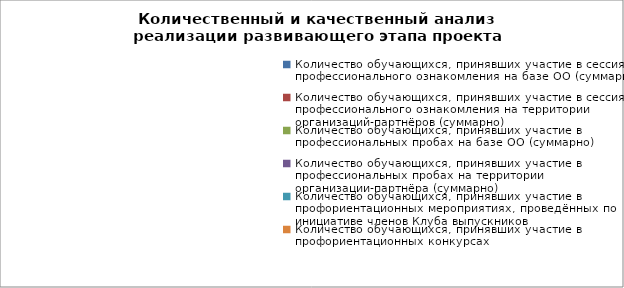
| Category | Series 0 |
|---|---|
| Количество обучающихся, принявших участие в сессиях профессионального ознакомления на базе ОО (суммарно) | 0 |
| Количество обучающихся, принявших участие в сессиях профессионального ознакомления на территории организаций-партнёров (суммарно) | 0 |
| Количество обучающихся, принявших участие в профессиональных пробах на базе ОО (суммарно) | 0 |
| Количество обучающихся, принявших участие в профессиональных пробах на территории организации-партнёра (суммарно) | 0 |
| Количество обучающихся, принявших участие в профориентационных мероприятиях, проведённых по инициативе членов Клуба выпускников | 0 |
| Количество обучающихся, принявших участие в профориентационных конкурсах  | 0 |